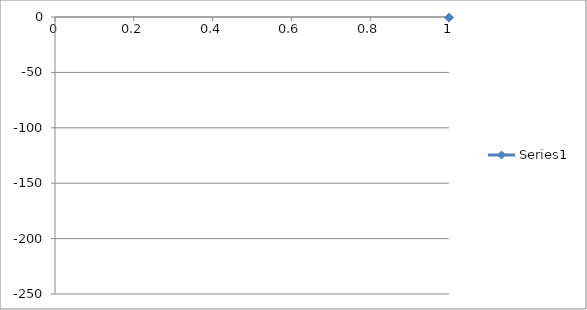
| Category | Series 0 |
|---|---|
| 0 | -0.575 |
| 1 | -0.636 |
| 2 | -0.679 |
| 3 | -0.733 |
| 4 | -0.767 |
| 5 | -0.808 |
| 6 | -0.868 |
| 7 | -0.918 |
| 8 | -0.973 |
| 9 | -1.055 |
| 10 | -1.136 |
| 11 | -1.229 |
| 12 | -1.331 |
| 13 | -1.447 |
| 14 | -1.564 |
| 15 | -1.71 |
| 16 | -1.865 |
| 17 | -2.069 |
| 18 | -2.302 |
| 19 | -2.533 |
| 20 | -2.818 |
| 21 | -3.166 |
| 22 | -3.571 |
| 23 | -4.077 |
| 24 | -4.643 |
| 25 | -5.343 |
| 26 | -6.16 |
| 27 | -7.688 |
| 28 | -9.144 |
| 29 | -10.827 |
| 30 | -13.429 |
| 31 | -14.844 |
| 32 | -16.071 |
| 33 | -17.424 |
| 34 | -18.996 |
| 35 | -20.632 |
| 36 | -23.011 |
| 37 | -24.928 |
| 38 | -27.645 |
| 39 | -30.288 |
| 40 | -33.331 |
| 41 | -36.7 |
| 42 | -41.033 |
| 43 | -45.323 |
| 44 | -50.041 |
| 45 | -55.462 |
| 46 | -61.389 |
| 47 | -67.531 |
| 48 | -74.308 |
| 49 | -81.861 |
| 50 | -89.528 |
| 51 | -98.058 |
| 52 | -106.919 |
| 53 | -115.379 |
| 54 | -124.884 |
| 55 | -133.881 |
| 56 | -142.917 |
| 57 | -152.099 |
| 58 | -160.929 |
| 59 | -169.251 |
| 60 | -177.38 |
| 61 | -185.134 |
| 62 | -192.081 |
| 63 | -198.158 |
| 64 | -204.094 |
| 65 | -208.805 |
| 66 | -213.325 |
| 67 | -217.321 |
| 68 | -220.453 |
| 69 | -223.205 |
| 70 | -225.705 |
| 71 | -227.541 |
| 72 | -229.117 |
| 73 | -230.467 |
| 74 | -231.083 |
| 75 | -231.654 |
| 76 | -232.159 |
| 77 | -232.611 |
| 78 | -232.841 |
| 79 | -233.045 |
| 80 | -233.143 |
| 81 | -233.195 |
| 82 | -233.213 |
| 83 | -233.146 |
| 84 | -232.973 |
| 85 | -232.649 |
| 86 | -232.249 |
| 87 | -231.614 |
| 88 | -230.117 |
| 89 | -228.787 |
| 90 | -227.222 |
| 91 | -224.615 |
| 92 | -222.023 |
| 93 | -219.145 |
| 94 | -215.103 |
| 95 | -210.489 |
| 96 | -205.679 |
| 97 | -199.95 |
| 98 | -193.796 |
| 99 | -186.754 |
| 100 | -179.386 |
| 101 | -171.167 |
| 102 | -163.058 |
| 103 | -154.093 |
| 104 | -144.914 |
| 105 | -135.712 |
| 106 | -126.501 |
| 107 | -117.617 |
| 108 | -108.252 |
| 109 | -99.806 |
| 110 | -91.404 |
| 111 | -83.543 |
| 112 | -75.639 |
| 113 | -68.824 |
| 114 | -62.602 |
| 115 | -56.696 |
| 116 | -50.958 |
| 117 | -46.645 |
| 118 | -42.084 |
| 119 | -38.163 |
| 120 | -34.297 |
| 121 | -31.464 |
| 122 | -28.605 |
| 123 | -25.898 |
| 124 | -23.342 |
| 125 | -21.556 |
| 126 | -19.843 |
| 127 | -18.085 |
| 128 | -16.511 |
| 129 | -15.159 |
| 130 | -13.855 |
| 131 | -11.321 |
| 132 | -9.647 |
| 133 | -8.115 |
| 134 | -6.74 |
| 135 | -6.138 |
| 136 | -5.368 |
| 137 | -4.675 |
| 138 | -4.072 |
| 139 | -3.562 |
| 140 | -3.131 |
| 141 | -2.757 |
| 142 | -2.437 |
| 143 | -2.194 |
| 144 | -1.96 |
| 145 | -1.73 |
| 146 | -1.557 |
| 147 | -1.42 |
| 148 | -1.294 |
| 149 | -1.169 |
| 150 | -1.048 |
| 151 | -0.948 |
| 152 | -0.853 |
| 153 | -0.77 |
| 154 | -0.703 |
| 155 | -0.638 |
| 156 | -0.573 |
| 157 | -0.529 |
| 158 | -0.468 |
| 159 | -0.409 |
| 160 | -0.358 |